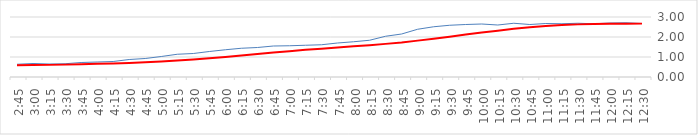
| Category | Series 0 | Series 1 |
|---|---|---|
| 2017-02-24 12:30:00 | 2.675 | 2.669 |
| 2017-02-24 12:15:00 | 2.712 | 2.666 |
| 2017-02-24 12:00:00 | 2.7 | 2.658 |
| 2017-02-24 11:45:00 | 2.662 | 2.646 |
| 2017-02-24 11:30:00 | 2.688 | 2.631 |
| 2017-02-24 11:15:00 | 2.662 | 2.601 |
| 2017-02-24 11:00:00 | 2.675 | 2.55 |
| 2017-02-24 10:45:00 | 2.625 | 2.486 |
| 2017-02-24 10:30:00 | 2.688 | 2.408 |
| 2017-02-24 10:15:00 | 2.6 | 2.315 |
| 2017-02-24 10:00:00 | 2.65 | 2.225 |
| 2017-02-24 09:45:00 | 2.625 | 2.121 |
| 2017-02-24 09:30:00 | 2.588 | 2.018 |
| 2017-02-24 09:15:00 | 2.512 | 1.915 |
| 2017-02-24 09:00:00 | 2.388 | 1.819 |
| 2017-02-24 08:45:00 | 2.15 | 1.728 |
| 2017-02-24 08:30:00 | 2.038 | 1.656 |
| 2017-02-24 08:15:00 | 1.838 | 1.589 |
| 2017-02-24 08:00:00 | 1.762 | 1.532 |
| 2017-02-24 07:45:00 | 1.7 | 1.474 |
| 2017-02-24 07:30:00 | 1.612 | 1.418 |
| 2017-02-24 07:15:00 | 1.588 | 1.359 |
| 2017-02-24 07:00:00 | 1.562 | 1.292 |
| 2017-02-24 06:45:00 | 1.55 | 1.224 |
| 2017-02-24 06:30:00 | 1.475 | 1.146 |
| 2017-02-24 06:15:00 | 1.438 | 1.074 |
| 2017-02-24 06:00:00 | 1.362 | 1.002 |
| 2017-02-24 05:45:00 | 1.275 | 0.932 |
| 2017-02-24 05:30:00 | 1.175 | 0.87 |
| 2017-02-24 05:15:00 | 1.138 | 0.82 |
| 2017-02-24 05:00:00 | 1.025 | 0.77 |
| 2017-02-24 04:45:00 | 0.925 | 0.734 |
| 2017-02-24 04:30:00 | 0.875 | 0.705 |
| 2017-02-24 04:15:00 | 0.775 | 0.679 |
| 2017-02-24 04:00:00 | 0.75 | 0.659 |
| 2017-02-24 03:45:00 | 0.725 | 0.638 |
| 2017-02-24 03:30:00 | 0.662 | 0.619 |
| 2017-02-24 03:15:00 | 0.65 | 0.606 |
| 2017-02-24 03:00:00 | 0.675 | 0.595 |
| 2017-02-24 02:45:00 | 0.638 | 0.582 |